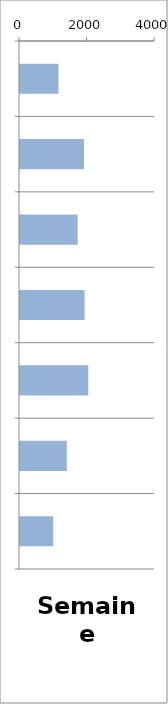
| Category | VL |
|---|---|
| 0 | 1141 |
| 1 | 1896 |
| 2 | 1709 |
| 3 | 1914 |
| 4 | 2022 |
| 5 | 1386 |
| 6 | 985 |